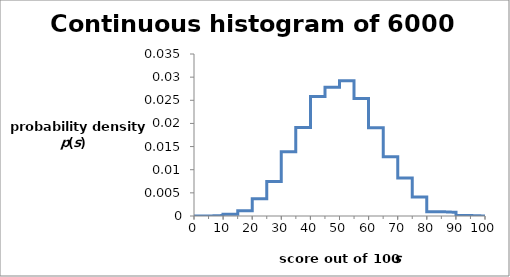
| Category | Series 0 |
|---|---|
| 0.0 | 0 |
| 0.0 | 0 |
| 5.0 | 0 |
| 5.0 | 0 |
| 10.0 | 0 |
| 10.0 | 0 |
| 15.0 | 0 |
| 15.0 | 0.001 |
| 20.0 | 0.001 |
| 20.0 | 0.004 |
| 25.0 | 0.004 |
| 25.0 | 0.007 |
| 30.0 | 0.007 |
| 30.0 | 0.014 |
| 35.0 | 0.014 |
| 35.0 | 0.019 |
| 40.0 | 0.019 |
| 40.0 | 0.026 |
| 45.0 | 0.026 |
| 45.0 | 0.028 |
| 50.0 | 0.028 |
| 50.0 | 0.029 |
| 55.0 | 0.029 |
| 55.0 | 0.025 |
| 60.0 | 0.025 |
| 60.0 | 0.019 |
| 65.0 | 0.019 |
| 65.0 | 0.013 |
| 70.0 | 0.013 |
| 70.0 | 0.008 |
| 75.0 | 0.008 |
| 75.0 | 0.004 |
| 80.0 | 0.004 |
| 80.0 | 0.001 |
| 85.0 | 0.001 |
| 85.0 | 0.001 |
| 90.0 | 0.001 |
| 90.0 | 0 |
| 95.0 | 0 |
| 95.0 | 0 |
| 100.0 | 0 |